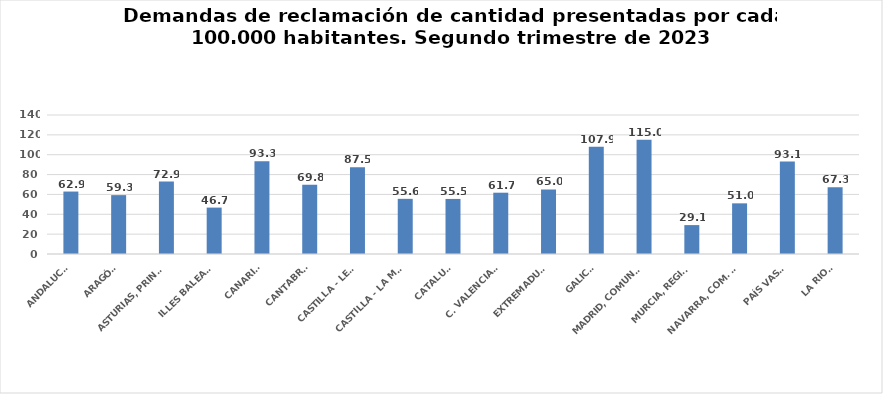
| Category | Series 0 |
|---|---|
| ANDALUCÍA | 62.904 |
| ARAGÓN | 59.289 |
| ASTURIAS, PRINCIPADO | 72.918 |
| ILLES BALEARS | 46.738 |
| CANARIAS | 93.316 |
| CANTABRIA | 69.835 |
| CASTILLA - LEÓN | 87.469 |
| CASTILLA - LA MANCHA | 55.56 |
| CATALUÑA | 55.462 |
| C. VALENCIANA | 61.745 |
| EXTREMADURA | 64.972 |
| GALICIA | 107.9 |
| MADRID, COMUNIDAD | 114.981 |
| MURCIA, REGIÓN | 29.111 |
| NAVARRA, COM. FORAL | 51.026 |
| PAÍS VASCO | 93.067 |
| LA RIOJA | 67.336 |